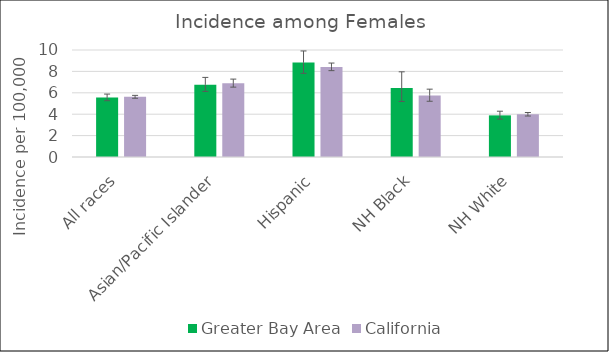
| Category | Greater Bay Area | California | SEER 18 |
|---|---|---|---|
| All races | 5.56 | 5.62 |  |
| Asian/Pacific Islander | 6.76 | 6.9 |  |
| Hispanic | 8.83 | 8.42 |  |
| NH Black | 6.45 | 5.75 |  |
| NH White | 3.89 | 3.99 |  |